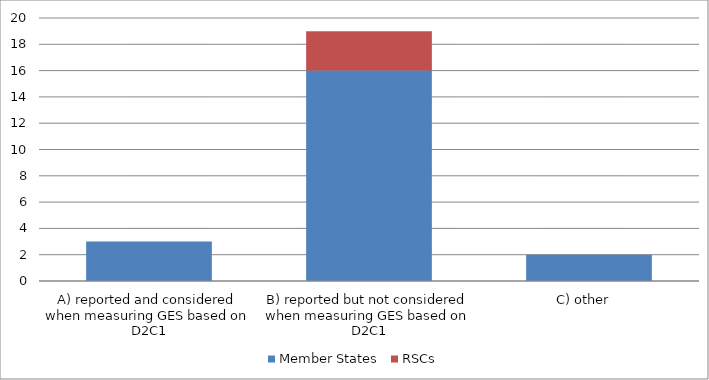
| Category | Member States | RSCs |
|---|---|---|
| A) reported and considered when measuring GES based on D2C1 | 3 | 0 |
| B) reported but not considered when measuring GES based on D2C1 | 16 | 3 |
| C) other   | 2 | 0 |